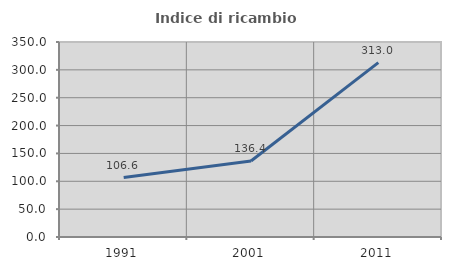
| Category | Indice di ricambio occupazionale  |
|---|---|
| 1991.0 | 106.621 |
| 2001.0 | 136.391 |
| 2011.0 | 312.99 |